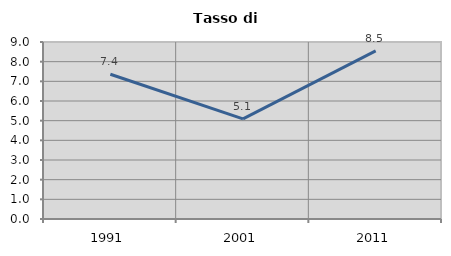
| Category | Tasso di disoccupazione   |
|---|---|
| 1991.0 | 7.359 |
| 2001.0 | 5.095 |
| 2011.0 | 8.55 |